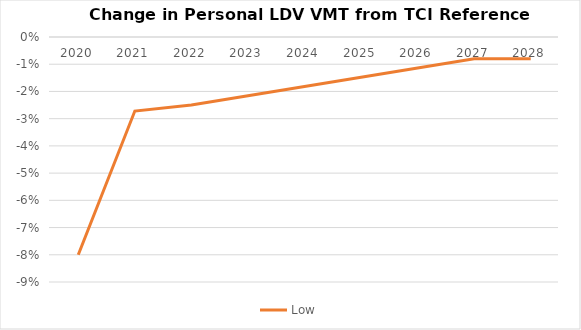
| Category | Low |
|---|---|
| 2020.0 | -0.08 |
| 2021.0 | -0.027 |
| 2022.0 | -0.025 |
| 2023.0 | -0.022 |
| 2024.0 | -0.018 |
| 2025.0 | -0.015 |
| 2026.0 | -0.011 |
| 2027.0 | -0.008 |
| 2028.0 | -0.008 |